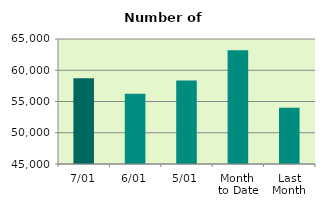
| Category | Series 0 |
|---|---|
| 7/01 | 58704 |
| 6/01 | 56240 |
| 5/01 | 58372 |
| Month 
to Date | 63203.5 |
| Last
Month | 53997.143 |